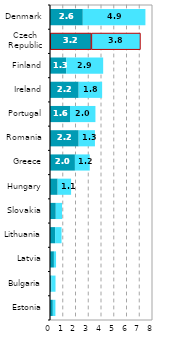
| Category |  ICT vybavení |  Software |
|---|---|---|
| Estonia | 0.222 | 0.202 |
| Bulgaria | 0.109 | 0.324 |
| Latvia | 0.308 | 0.166 |
| Lithuania | 0.402 | 0.505 |
| Slovakia | 0.454 | 0.491 |
| Hungary | 0.601 | 1.053 |
| Greece | 1.954 | 1.163 |
| Romania | 2.248 | 1.278 |
| Portugal | 1.567 | 1.996 |
| Ireland | 2.249 | 1.84 |
| Finland | 1.274 | 2.896 |
| Czech Republic | 3.228 | 3.848 |
| Denmark | 2.574 | 4.91 |